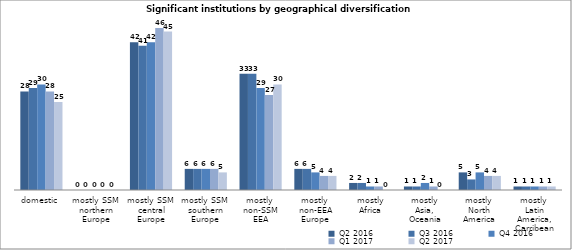
| Category | Q2 2016 | Q3 2016 | Q4 2016 | Q1 2017 | Q2 2017 |
|---|---|---|---|---|---|
| domestic | 28 | 29 | 30 | 28 | 25 |
| mostly SSM 
northern Europe | 0 | 0 | 0 | 0 | 0 |
| mostly SSM 
central Europe | 42 | 41 | 42 | 46 | 45 |
| mostly SSM 
southern Europe | 6 | 6 | 6 | 6 | 5 |
| mostly 
non-SSM EEA | 33 | 33 | 29 | 27 | 30 |
| mostly 
non-EEA Europe | 6 | 6 | 5 | 4 | 4 |
| mostly
Africa | 2 | 2 | 1 | 1 | 0 |
| mostly 
Asia, 
Oceania | 1 | 1 | 2 | 1 | 0 |
| mostly 
North America | 5 | 3 | 5 | 4 | 4 |
| mostly 
Latin America,
Carribean | 1 | 1 | 1 | 1 | 1 |